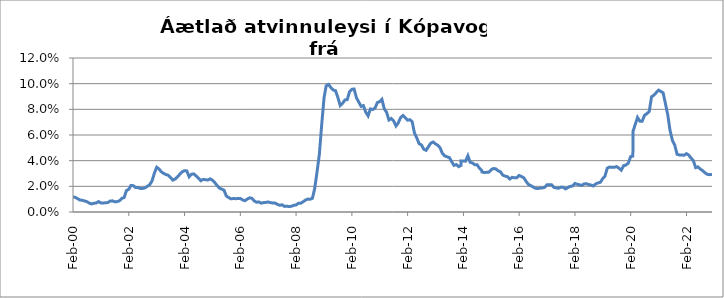
| Category | Series 0 |
|---|---|
| 2000-02-01 | 0.012 |
| 2000-03-01 | 0.011 |
| 2000-04-01 | 0.01 |
| 2000-05-01 | 0.009 |
| 2000-06-01 | 0.009 |
| 2000-07-01 | 0.009 |
| 2000-08-01 | 0.008 |
| 2000-09-01 | 0.007 |
| 2000-10-01 | 0.006 |
| 2000-11-01 | 0.007 |
| 2000-12-01 | 0.007 |
| 2001-01-01 | 0.008 |
| 2001-02-01 | 0.007 |
| 2001-03-01 | 0.007 |
| 2001-04-01 | 0.007 |
| 2001-05-01 | 0.007 |
| 2001-06-01 | 0.009 |
| 2001-07-01 | 0.009 |
| 2001-08-01 | 0.008 |
| 2001-09-01 | 0.008 |
| 2001-10-01 | 0.009 |
| 2001-11-01 | 0.011 |
| 2001-12-01 | 0.011 |
| 2002-01-01 | 0.017 |
| 2002-02-01 | 0.018 |
| 2002-03-01 | 0.021 |
| 2002-04-01 | 0.02 |
| 2002-05-01 | 0.019 |
| 2002-06-01 | 0.019 |
| 2002-07-01 | 0.018 |
| 2002-08-01 | 0.018 |
| 2002-09-01 | 0.019 |
| 2002-10-01 | 0.02 |
| 2002-11-01 | 0.021 |
| 2002-12-01 | 0.024 |
| 2003-01-01 | 0.03 |
| 2003-02-01 | 0.035 |
| 2003-03-01 | 0.034 |
| 2003-04-01 | 0.031 |
| 2003-05-01 | 0.03 |
| 2003-06-01 | 0.029 |
| 2003-07-01 | 0.029 |
| 2003-08-01 | 0.027 |
| 2003-09-01 | 0.025 |
| 2003-10-01 | 0.026 |
| 2003-11-01 | 0.028 |
| 2003-12-01 | 0.029 |
| 2004-01-01 | 0.031 |
| 2004-02-01 | 0.032 |
| 2004-03-01 | 0.032 |
| 2004-04-01 | 0.027 |
| 2004-05-01 | 0.029 |
| 2004-06-01 | 0.03 |
| 2004-07-01 | 0.028 |
| 2004-08-01 | 0.026 |
| 2004-09-01 | 0.024 |
| 2004-10-01 | 0.025 |
| 2004-11-01 | 0.025 |
| 2004-12-01 | 0.025 |
| 2005-01-01 | 0.026 |
| 2005-02-01 | 0.025 |
| 2005-03-01 | 0.023 |
| 2005-04-01 | 0.021 |
| 2005-05-01 | 0.019 |
| 2005-06-01 | 0.018 |
| 2005-07-01 | 0.017 |
| 2005-08-01 | 0.012 |
| 2005-09-01 | 0.011 |
| 2005-10-01 | 0.01 |
| 2005-11-01 | 0.011 |
| 2005-12-01 | 0.01 |
| 2006-01-01 | 0.01 |
| 2006-02-01 | 0.011 |
| 2006-03-01 | 0.009 |
| 2006-04-01 | 0.009 |
| 2006-05-01 | 0.01 |
| 2006-06-01 | 0.011 |
| 2006-07-01 | 0.011 |
| 2006-08-01 | 0.009 |
| 2006-09-01 | 0.008 |
| 2006-10-01 | 0.008 |
| 2006-11-01 | 0.007 |
| 2006-12-01 | 0.007 |
| 2007-01-01 | 0.008 |
| 2007-02-01 | 0.008 |
| 2007-03-01 | 0.007 |
| 2007-04-01 | 0.007 |
| 2007-05-01 | 0.007 |
| 2007-06-01 | 0.006 |
| 2007-07-01 | 0.005 |
| 2007-08-01 | 0.006 |
| 2007-09-01 | 0.004 |
| 2007-10-01 | 0.004 |
| 2007-11-01 | 0.004 |
| 2007-12-01 | 0.004 |
| 2008-01-01 | 0.005 |
| 2008-02-01 | 0.005 |
| 2008-03-01 | 0.007 |
| 2008-04-01 | 0.007 |
| 2008-05-01 | 0.008 |
| 2008-06-01 | 0.009 |
| 2008-07-01 | 0.01 |
| 2008-08-01 | 0.01 |
| 2008-09-01 | 0.011 |
| 2008-10-01 | 0.018 |
| 2008-11-01 | 0.031 |
| 2008-12-01 | 0.045 |
| 2009-01-01 | 0.068 |
| 2009-02-01 | 0.089 |
| 2009-03-01 | 0.098 |
| 2009-04-01 | 0.099 |
| 2009-05-01 | 0.097 |
| 2009-06-01 | 0.095 |
| 2009-07-01 | 0.095 |
| 2009-08-01 | 0.089 |
| 2009-09-01 | 0.083 |
| 2009-10-01 | 0.085 |
| 2009-11-01 | 0.087 |
| 2009-12-01 | 0.088 |
| 2010-01-01 | 0.094 |
| 2010-02-01 | 0.096 |
| 2010-03-01 | 0.096 |
| 2010-04-01 | 0.089 |
| 2010-05-01 | 0.086 |
| 2010-06-01 | 0.082 |
| 2010-07-01 | 0.083 |
| 2010-08-01 | 0.078 |
| 2010-09-01 | 0.075 |
| 2010-10-01 | 0.08 |
| 2010-11-01 | 0.08 |
| 2010-12-01 | 0.081 |
| 2011-01-01 | 0.085 |
| 2011-02-01 | 0.086 |
| 2011-03-01 | 0.088 |
| 2011-04-01 | 0.08 |
| 2011-05-01 | 0.078 |
| 2011-06-01 | 0.072 |
| 2011-07-01 | 0.073 |
| 2011-08-01 | 0.071 |
| 2011-09-01 | 0.067 |
| 2011-10-01 | 0.069 |
| 2011-11-01 | 0.074 |
| 2011-12-01 | 0.075 |
| 2012-01-31 | 0.072 |
| 2012-02-29 | 0.072 |
| 2012-03-31 | 0.07 |
| 2012-04-30 | 0.062 |
| 2012-05-31 | 0.058 |
| 2012-06-30 | 0.053 |
| 2012-07-31 | 0.052 |
| 2012-08-31 | 0.049 |
| 2012-09-30 | 0.048 |
| 2012-10-31 | 0.051 |
| 2012-11-30 | 0.054 |
| 2012-12-31 | 0.055 |
| 2013-01-31 | 0.053 |
| 2013-02-28 | 0.052 |
| 2013-03-31 | 0.05 |
| 2013-04-30 | 0.046 |
| 2013-05-31 | 0.044 |
| 2013-06-30 | 0.043 |
| 2013-07-31 | 0.042 |
| 2013-08-31 | 0.039 |
| 2013-09-30 | 0.036 |
| 2013-10-31 | 0.037 |
| 2013-11-30 | 0.035 |
| 2013-12-31 | 0.036 |
| 2014-01-01 | 0.04 |
| 2014-02-28 | 0.04 |
| 2014-03-31 | 0.044 |
| 2014-04-30 | 0.039 |
| 2014-05-31 | 0.038 |
| 2014-06-30 | 0.037 |
| 2014-07-31 | 0.037 |
| 2014-08-31 | 0.034 |
| 2014-09-30 | 0.032 |
| 2014-10-01 | 0.031 |
| 2014-11-01 | 0.031 |
| 2014-12-31 | 0.031 |
| 2015-01-31 | 0.033 |
| 2015-02-28 | 0.034 |
| 2015-03-31 | 0.034 |
| 2015-04-30 | 0.032 |
| 2015-05-31 | 0.031 |
| 2015-06-30 | 0.029 |
| 2015-07-31 | 0.028 |
| 2015-08-31 | 0.028 |
| 2015-09-30 | 0.026 |
| 2015-10-31 | 0.027 |
| 2015-11-30 | 0.027 |
| 2015-12-31 | 0.027 |
| 2016-01-31 | 0.028 |
| 2016-02-29 | 0.028 |
| 2016-03-31 | 0.027 |
| 2016-04-30 | 0.024 |
| 2016-05-31 | 0.022 |
| 2016-06-30 | 0.021 |
| 2016-07-31 | 0.019 |
| 2016-08-31 | 0.019 |
| 2016-09-30 | 0.018 |
| 2016-10-31 | 0.019 |
| 2016-11-30 | 0.019 |
| 2016-12-31 | 0.019 |
| 2017-01-31 | 0.021 |
| 2017-02-28 | 0.021 |
| 2017-03-31 | 0.021 |
| 2017-04-30 | 0.019 |
| 2017-05-31 | 0.019 |
| 2017-06-30 | 0.019 |
| 2017-07-31 | 0.019 |
| 2017-08-31 | 0.019 |
| 2017-09-30 | 0.018 |
| 2017-10-31 | 0.019 |
| 2017-11-30 | 0.02 |
| 2017-12-31 | 0.02 |
| 2018-01-31 | 0.022 |
| 2018-02-28 | 0.022 |
| 2018-03-31 | 0.021 |
| 2018-04-30 | 0.021 |
| 2018-05-31 | 0.022 |
| 2018-06-30 | 0.022 |
| 2018-07-31 | 0.021 |
| 2018-08-31 | 0.021 |
| 2018-09-30 | 0.02 |
| 2018-10-31 | 0.022 |
| 2018-11-30 | 0.023 |
| 2018-12-31 | 0.023 |
| 2019-01-31 | 0.026 |
| 2019-02-28 | 0.028 |
| 2019-03-31 | 0.034 |
| 2019-04-30 | 0.035 |
| 2019-05-31 | 0.035 |
| 2019-06-30 | 0.035 |
| 2019-07-31 | 0.035 |
| 2019-08-31 | 0.034 |
| 2019-09-30 | 0.033 |
| 2019-10-31 | 0.036 |
| 2019-11-30 | 0.037 |
| 2019-12-31 | 0.038 |
| 2020-01-31 | 0.043 |
| 2020-02-29 | 0.044 |
| 2020-03-01 | 0.063 |
| 2020-04-30 | 0.074 |
| 2020-05-31 | 0.071 |
| 2020-06-30 | 0.071 |
| 2020-07-31 | 0.075 |
| 2020-08-31 | 0.077 |
| 2020-09-30 | 0.078 |
| 2020-10-31 | 0.09 |
| 2020-11-30 | 0.091 |
| 2020-12-31 | 0.093 |
| 2021-01-31 | 0.095 |
| 2021-02-28 | 0.094 |
| 2021-03-31 | 0.093 |
| 2021-04-30 | 0.085 |
| 2021-05-31 | 0.076 |
| 2021-06-30 | 0.064 |
| 2021-07-31 | 0.056 |
| 2021-08-31 | 0.052 |
| 2021-09-30 | 0.045 |
| 2021-10-31 | 0.044 |
| 2021-11-30 | 0.044 |
| 2021-12-31 | 0.044 |
| 2022-01-31 | 0.045 |
| 2022-02-28 | 0.044 |
| 2022-03-31 | 0.042 |
| 2022-04-30 | 0.04 |
| 2022-05-31 | 0.035 |
| 2022-06-30 | 0.035 |
| 2022-07-31 | 0.033 |
| 2022-08-31 | 0.032 |
| 2022-09-30 | 0.031 |
| 2022-10-31 | 0.029 |
| 2022-11-30 | 0.029 |
| 2022-12-31 | 0.029 |